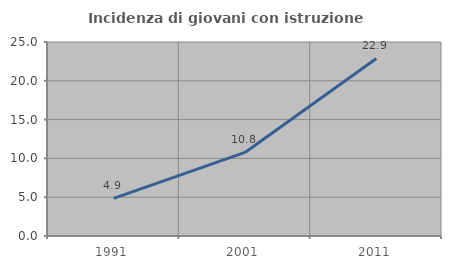
| Category | Incidenza di giovani con istruzione universitaria |
|---|---|
| 1991.0 | 4.854 |
| 2001.0 | 10.769 |
| 2011.0 | 22.881 |